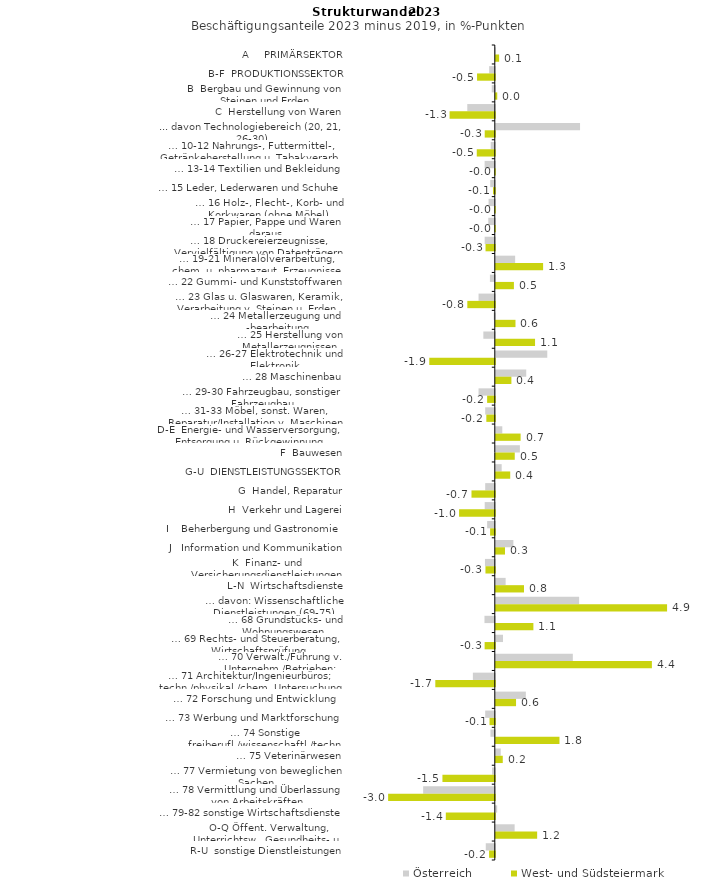
| Category | Österreich | West- und Südsteiermark |
|---|---|---|
| A     PRIMÄRSEKTOR | -0.007 | 0.095 |
| B-F  PRODUKTIONSSEKTOR | -0.161 | -0.504 |
| B  Bergbau und Gewinnung von Steinen und Erden | -0.086 | 0.041 |
| C  Herstellung von Waren | -0.782 | -1.284 |
| ... davon Technologiebereich (20, 21, 26-30) | 2.393 | -0.286 |
| … 10-12 Nahrungs-, Futtermittel-, Getränkeherstellung u. Tabakverarb. | -0.116 | -0.512 |
| … 13-14 Textilien und Bekleidung | -0.289 | -0.017 |
| … 15 Leder, Lederwaren und Schuhe | -0.13 | -0.051 |
| … 16 Holz-, Flecht-, Korb- und Korkwaren (ohne Möbel)  | -0.177 | -0.014 |
| … 17 Papier, Pappe und Waren daraus  | -0.185 | -0.015 |
| … 18 Druckereierzeugnisse, Vervielfältigung von Datenträgern | -0.288 | -0.263 |
| … 19-21 Mineralölverarbeitung, chem. u. pharmazeut. Erzeugnisse | 0.549 | 1.344 |
| … 22 Gummi- und Kunststoffwaren | -0.139 | 0.515 |
| … 23 Glas u. Glaswaren, Keramik, Verarbeitung v. Steinen u. Erden  | -0.462 | -0.781 |
| … 24 Metallerzeugung und -bearbeitung | -0.032 | 0.559 |
| … 25 Herstellung von Metallerzeugnissen  | -0.325 | 1.115 |
| … 26-27 Elektrotechnik und Elektronik | 1.462 | -1.862 |
| … 28 Maschinenbau | 0.864 | 0.443 |
| … 29-30 Fahrzeugbau, sonstiger Fahrzeugbau | -0.462 | -0.218 |
| … 31-33 Möbel, sonst. Waren, Reparatur/Installation v. Maschinen | -0.273 | -0.241 |
| D-E  Energie- und Wasserversorgung, Entsorgung u. Rückgewinnung | 0.184 | 0.705 |
| F  Bauwesen | 0.684 | 0.538 |
| G-U  DIENSTLEISTUNGSSEKTOR | 0.167 | 0.41 |
| G  Handel, Reparatur | -0.273 | -0.662 |
| H  Verkehr und Lagerei | -0.287 | -1.015 |
| I    Beherbergung und Gastronomie | -0.218 | -0.133 |
| J   Information und Kommunikation | 0.499 | 0.262 |
| K  Finanz- und Versicherungsdienstleistungen | -0.279 | -0.265 |
| L-N  Wirtschaftsdienste | 0.279 | 0.802 |
| … davon: Wissenschaftliche Dienstleistungen (69-75) | 2.367 | 4.866 |
| … 68 Grundstücks- und Wohnungswesen  | -0.294 | 1.068 |
| … 69 Rechts- und Steuerberatung, Wirtschaftsprüfung | 0.205 | -0.289 |
| … 70 Verwalt./Führung v. Unternehm./Betrieben; Unternehmensberat. | 2.188 | 4.434 |
| … 71 Architektur/Ingenieurbüros; techn./physikal./chem. Untersuchung | -0.622 | -1.69 |
| … 72 Forschung und Entwicklung  | 0.854 | 0.575 |
| … 73 Werbung und Marktforschung | -0.273 | -0.15 |
| … 74 Sonstige freiberufl./wissenschaftl./techn. Tätigkeiten | -0.124 | 1.809 |
| … 75 Veterinärwesen | 0.14 | 0.198 |
| … 77 Vermietung von beweglichen Sachen  | -0.077 | -1.488 |
| … 78 Vermittlung und Überlassung von Arbeitskräften | -2.035 | -3.031 |
| … 79-82 sonstige Wirtschaftsdienste | 0.039 | -1.392 |
| O-Q Öffent. Verwaltung, Unterrichtsw., Gesundheits- u. Sozialwesen | 0.535 | 1.175 |
| R-U  sonstige Dienstleistungen | -0.256 | -0.162 |